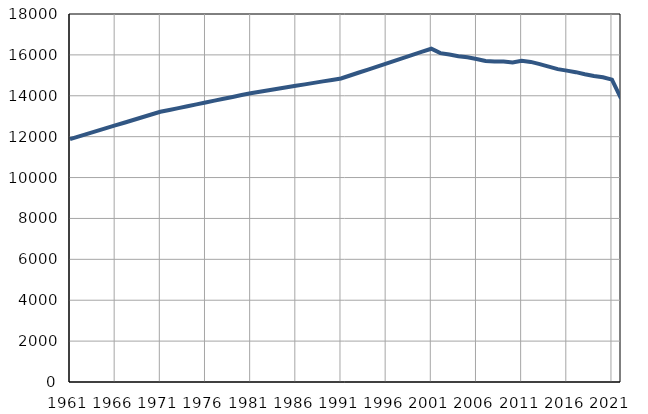
| Category | Population
size |
|---|---|
| 1961.0 | 11881 |
| 1962.0 | 12015 |
| 1963.0 | 12148 |
| 1964.0 | 12282 |
| 1965.0 | 12415 |
| 1966.0 | 12549 |
| 1967.0 | 12682 |
| 1968.0 | 12816 |
| 1969.0 | 12949 |
| 1970.0 | 13083 |
| 1971.0 | 13216 |
| 1972.0 | 13307 |
| 1973.0 | 13398 |
| 1974.0 | 13489 |
| 1975.0 | 13580 |
| 1976.0 | 13670 |
| 1977.0 | 13762 |
| 1978.0 | 13853 |
| 1979.0 | 13944 |
| 1980.0 | 14035 |
| 1981.0 | 14126 |
| 1982.0 | 14198 |
| 1983.0 | 14270 |
| 1984.0 | 14343 |
| 1985.0 | 14415 |
| 1986.0 | 14486 |
| 1987.0 | 14559 |
| 1988.0 | 14631 |
| 1989.0 | 14704 |
| 1990.0 | 14776 |
| 1991.0 | 14848 |
| 1992.0 | 14993 |
| 1993.0 | 15139 |
| 1994.0 | 15284 |
| 1995.0 | 15429 |
| 1996.0 | 15574 |
| 1997.0 | 15720 |
| 1998.0 | 15865 |
| 1999.0 | 16010 |
| 2000.0 | 16155 |
| 2001.0 | 16301 |
| 2002.0 | 16085 |
| 2003.0 | 16015 |
| 2004.0 | 15938 |
| 2005.0 | 15880 |
| 2006.0 | 15799 |
| 2007.0 | 15704 |
| 2008.0 | 15672 |
| 2009.0 | 15682 |
| 2010.0 | 15633 |
| 2011.0 | 15716 |
| 2012.0 | 15656 |
| 2013.0 | 15551 |
| 2014.0 | 15428 |
| 2015.0 | 15304 |
| 2016.0 | 15229 |
| 2017.0 | 15155 |
| 2018.0 | 15054 |
| 2019.0 | 14970 |
| 2020.0 | 14905 |
| 2021.0 | 14787 |
| 2022.0 | 13872 |